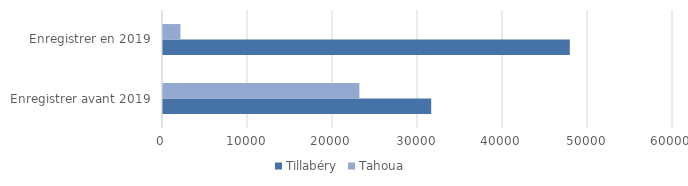
| Category | Tillabéry | Tahoua  |
|---|---|---|
| Enregistrer avant 2019 | 31553 | 23102 |
| Enregistrer en 2019 | 47859 | 2051 |